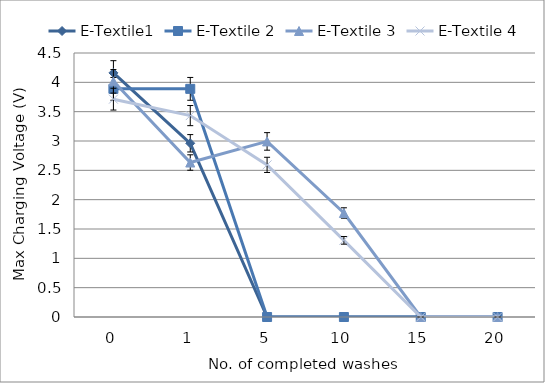
| Category | E-Textile1 | E-Textile 2 | E-Textile 3 | E-Textile 4 |
|---|---|---|---|---|
| 0.0 | 4.161 | 3.889 | 4.017 | 3.713 |
| 1.0 | 2.961 | 3.889 | 2.633 | 3.433 |
| 5.0 | 0 | 0 | 2.993 | 2.593 |
| 10.0 | 0 | 0 | 1.773 | 1.307 |
| 15.0 | 0 | 0 | 0 | 0 |
| 20.0 | 0 | 0 | 0 | 0 |